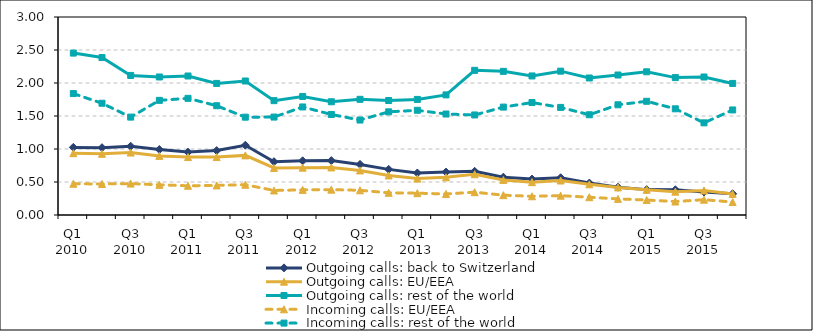
| Category | Outgoing calls: back to Switzerland | Outgoing calls: EU/EEA | Outgoing calls: rest of the world | Incoming calls: EU/EEA | Incoming calls: rest of the world |
|---|---|---|---|---|---|
| Q1 2010 | 1.024 | 0.937 | 2.453 | 0.473 | 1.84 |
| Q2 2010 | 1.02 | 0.927 | 2.385 | 0.47 | 1.693 |
| Q3 2010 | 1.042 | 0.946 | 2.115 | 0.476 | 1.483 |
| Q4 2010 | 0.992 | 0.896 | 2.091 | 0.457 | 1.737 |
| Q1 2011 | 0.953 | 0.878 | 2.106 | 0.443 | 1.768 |
| Q2 2011 | 0.976 | 0.878 | 1.994 | 0.449 | 1.656 |
| Q3 2011 | 1.058 | 0.903 | 2.03 | 0.459 | 1.482 |
| Q4 2011 | 0.808 | 0.713 | 1.733 | 0.372 | 1.484 |
| Q1 2012 | 0.821 | 0.717 | 1.796 | 0.381 | 1.637 |
| Q2 2012 | 0.824 | 0.721 | 1.716 | 0.384 | 1.523 |
| Q3 2012 | 0.767 | 0.675 | 1.753 | 0.374 | 1.439 |
| Q4 2012 | 0.691 | 0.599 | 1.735 | 0.336 | 1.563 |
| Q1 2013 | 0.637 | 0.551 | 1.751 | 0.331 | 1.586 |
| Q2 2013 | 0.65 | 0.571 | 1.82 | 0.318 | 1.53 |
| Q3 2013 | 0.662 | 0.618 | 2.192 | 0.346 | 1.516 |
| Q4 2013 | 0.573 | 0.53 | 2.177 | 0.3 | 1.635 |
| Q1 2014 | 0.544 | 0.498 | 2.107 | 0.284 | 1.704 |
| Q2 2014 | 0.565 | 0.522 | 2.179 | 0.293 | 1.63 |
| Q3 2014 | 0.484 | 0.465 | 2.076 | 0.269 | 1.519 |
| Q4 2014 | 0.421 | 0.418 | 2.121 | 0.244 | 1.67 |
| Q1 2015 | 0.385 | 0.382 | 2.17 | 0.227 | 1.723 |
| Q2 2015 | 0.382 | 0.354 | 2.082 | 0.204 | 1.609 |
| Q3 2015 | 0.349 | 0.372 | 2.091 | 0.232 | 1.396 |
| Q4 2015 | 0.321 | 0.319 | 1.994 | 0.196 | 1.592 |